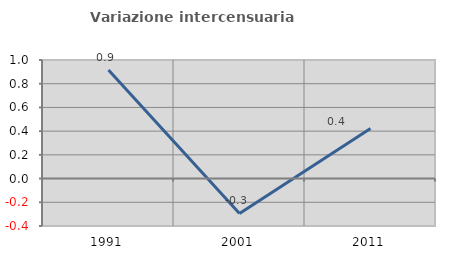
| Category | Variazione intercensuaria annua |
|---|---|
| 1991.0 | 0.915 |
| 2001.0 | -0.294 |
| 2011.0 | 0.423 |